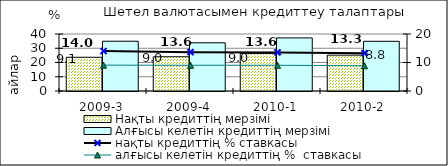
| Category | Нақты кредиттің мерзімі  | Алғысы келетін кредиттің мерзімі  |
|---|---|---|
| 2009-3 | 23.67 | 34.93 |
| 2009-4 | 24.02 | 33.82 |
| 2010-1 | 26.39 | 37.24 |
| 2010-2 | 25.16 | 34.87 |